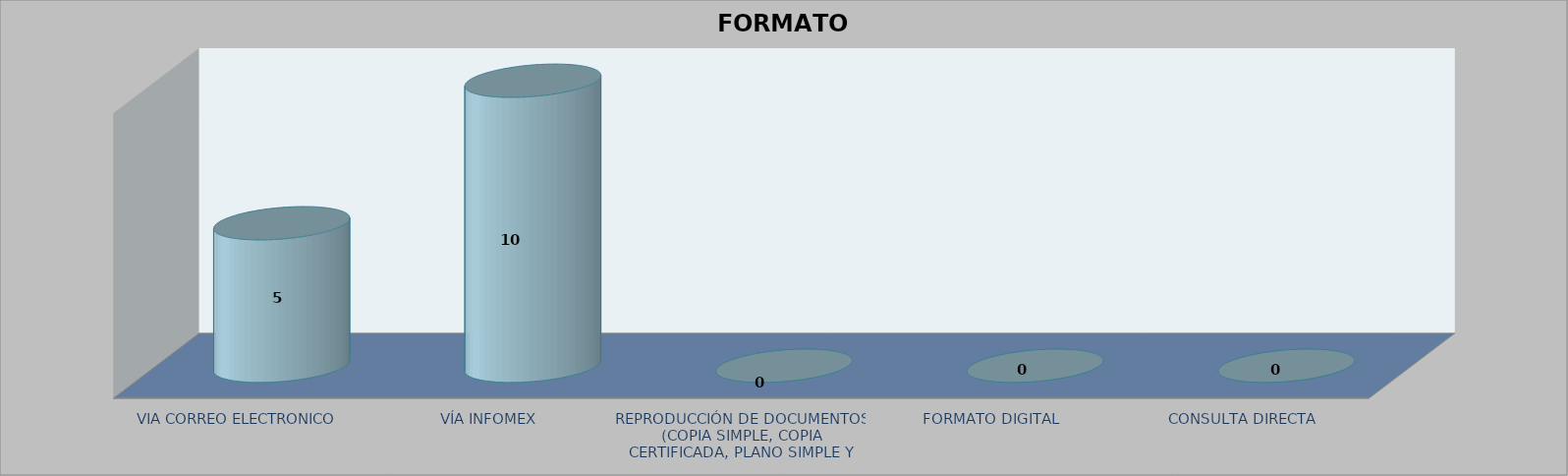
| Category |        FORMATO SOLICITADO | Series 1 | Series 2 |
|---|---|---|---|
| VIA CORREO ELECTRONICO |  |  | 5 |
| VÍA INFOMEX |  |  | 10 |
| REPRODUCCIÓN DE DOCUMENTOS (COPIA SIMPLE, COPIA CERTIFICADA, PLANO SIMPLE Y PLANO CERTIFICADO) |  |  | 0 |
| FORMATO DIGITAL |  |  | 0 |
| CONSULTA DIRECTA |  |  | 0 |